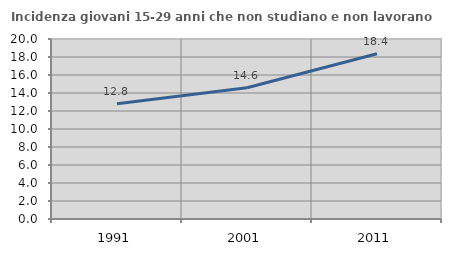
| Category | Incidenza giovani 15-29 anni che non studiano e non lavorano  |
|---|---|
| 1991.0 | 12.808 |
| 2001.0 | 14.583 |
| 2011.0 | 18.367 |